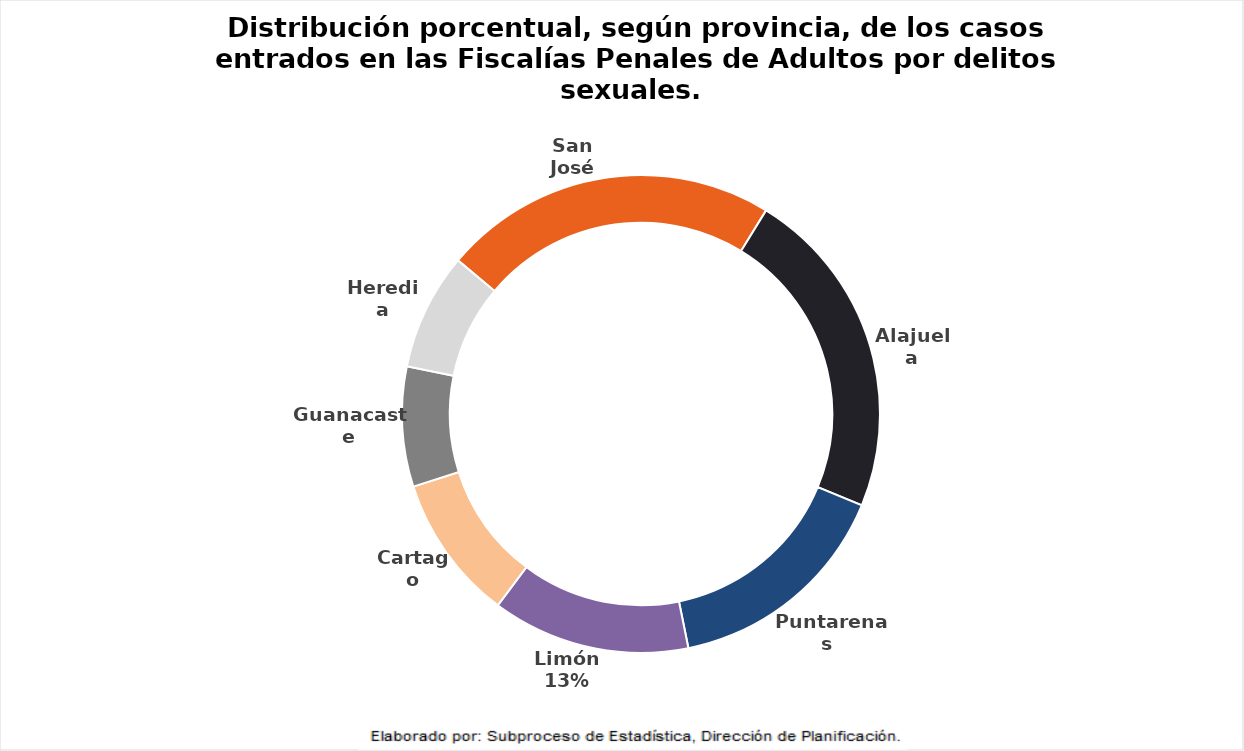
| Category | Delitos Sexuales |
|---|---|
| San José | 2163 |
| Alajuela | 2146 |
| Puntarenas  | 1487 |
| Limón | 1280 |
| Cartago | 941 |
| Guanacaste | 775 |
| Heredia | 755 |